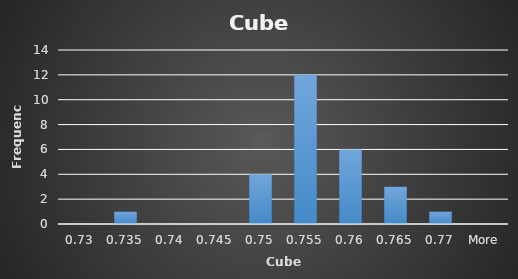
| Category | Frequency |
|---|---|
| 0.73 | 0 |
| 0.735 | 1 |
| 0.74 | 0 |
| 0.745 | 0 |
| 0.75 | 4 |
| 0.755 | 12 |
| 0.76 | 6 |
| 0.765 | 3 |
| 0.77 | 1 |
| More | 0 |